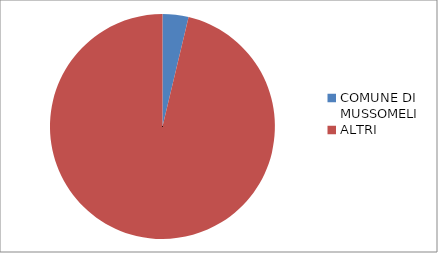
| Category | Series 0 |
|---|---|
| COMUNE DI MUSSOMELI | 3.73 |
| ALTRI | 96.27 |